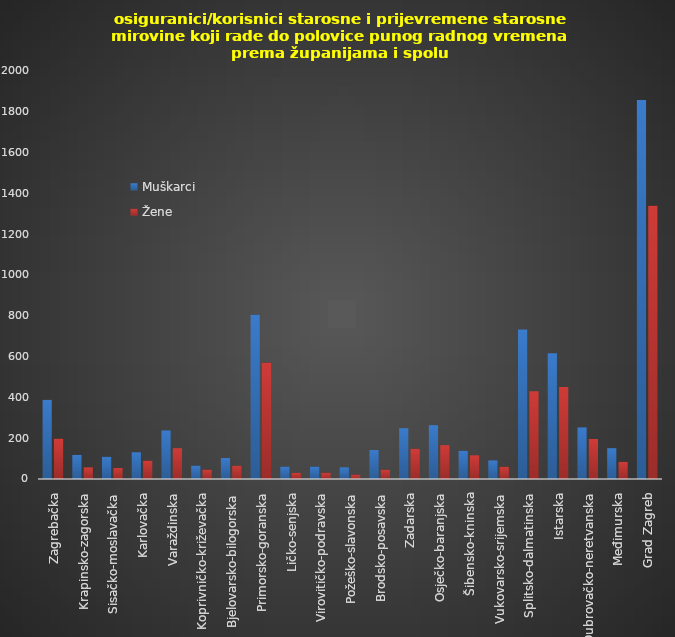
| Category | Muškarci | Žene |
|---|---|---|
| Zagrebačka | 388 | 198 |
| Krapinsko-zagorska | 118 | 57 |
| Sisačko-moslavačka | 109 | 54 |
| Karlovačka | 131 | 90 |
| Varaždinska | 238 | 151 |
| Koprivničko-križevačka | 66 | 46 |
| Bjelovarsko-bilogorska | 103 | 65 |
| Primorsko-goranska | 805 | 571 |
| Ličko-senjska | 61 | 30 |
| Virovitičko-podravska | 61 | 31 |
| Požeško-slavonska | 57 | 21 |
| Brodsko-posavska | 142 | 46 |
| Zadarska | 249 | 148 |
| Osječko-baranjska | 264 | 166 |
| Šibensko-kninska | 138 | 116 |
| Vukovarsko-srijemska | 91 | 60 |
| Splitsko-dalmatinska | 733 | 430 |
| Istarska | 616 | 451 |
| Dubrovačko-neretvanska | 253 | 196 |
| Međimurska | 151 | 84 |
| Grad Zagreb | 1858 | 1340 |